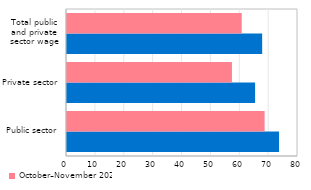
| Category | October–November 2021 | October–November 2020 |
|---|---|---|
| Public sector | 73.436 | 68.434 |
| Private sector | 65.144 | 57.121 |
| Total public
and private
sector wage | 67.592 | 60.518 |